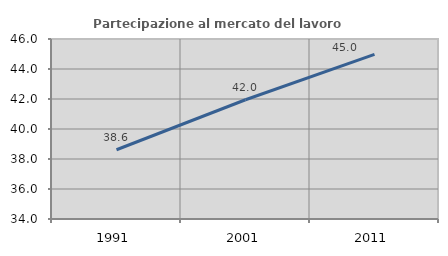
| Category | Partecipazione al mercato del lavoro  femminile |
|---|---|
| 1991.0 | 38.615 |
| 2001.0 | 41.951 |
| 2011.0 | 44.978 |